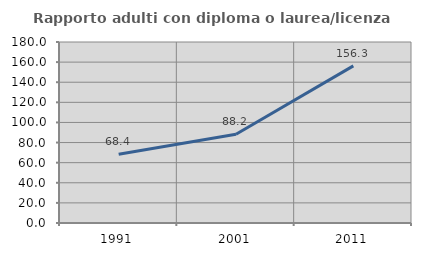
| Category | Rapporto adulti con diploma o laurea/licenza media  |
|---|---|
| 1991.0 | 68.421 |
| 2001.0 | 88.182 |
| 2011.0 | 156.25 |